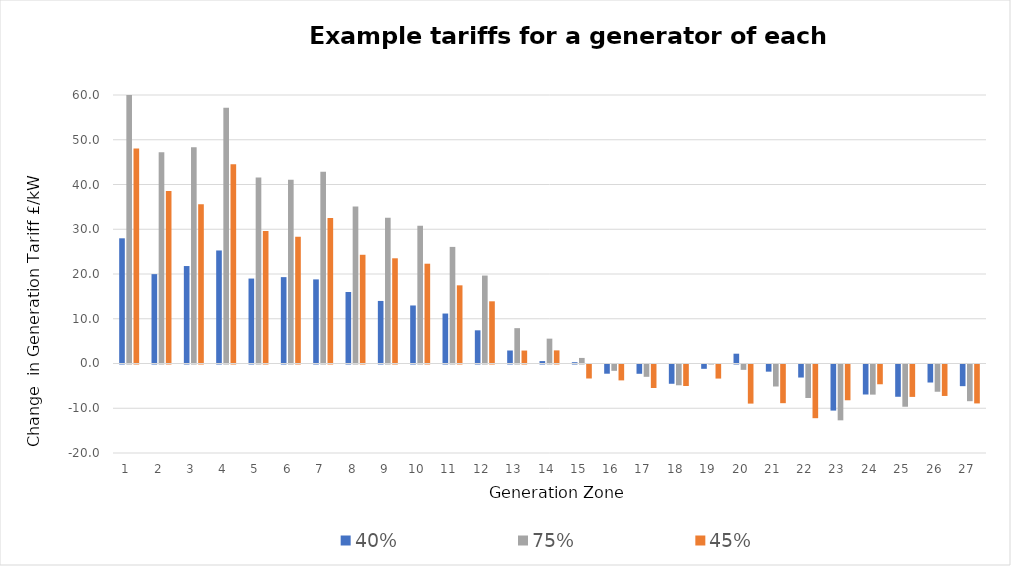
| Category | 40% | 75% | 45% |
|---|---|---|---|
| 1.0 | 27.979 | 62.594 | 48.051 |
| 2.0 | 19.969 | 47.189 | 38.543 |
| 3.0 | 21.779 | 48.308 | 35.599 |
| 4.0 | 25.26 | 57.128 | 44.498 |
| 5.0 | 18.981 | 41.557 | 29.605 |
| 6.0 | 19.302 | 41.046 | 28.322 |
| 7.0 | 18.796 | 42.857 | 32.507 |
| 8.0 | 15.975 | 35.11 | 24.296 |
| 9.0 | 13.98 | 32.595 | 23.511 |
| 10.0 | 12.967 | 30.756 | 22.299 |
| 11.0 | 11.166 | 26.056 | 17.468 |
| 12.0 | 7.416 | 19.651 | 13.898 |
| 13.0 | 2.907 | 7.899 | 2.893 |
| 14.0 | 0.54 | 5.555 | 2.932 |
| 15.0 | 0.292 | 1.243 | -3.127 |
| 16.0 | -2.059 | -1.414 | -3.55 |
| 17.0 | -2.075 | -2.752 | -5.249 |
| 18.0 | -4.308 | -4.643 | -4.81 |
| 19.0 | -0.964 | -0.002 | -3.143 |
| 20.0 | 2.192 | -1.198 | -8.737 |
| 21.0 | -1.6 | -4.916 | -8.643 |
| 22.0 | -2.913 | -7.492 | -11.999 |
| 23.0 | -10.301 | -12.476 | -7.992 |
| 24.0 | -6.704 | -6.733 | -4.416 |
| 25.0 | -7.212 | -9.439 | -7.242 |
| 26.0 | -4.025 | -6.087 | -7.03 |
| 27.0 | -4.842 | -8.201 | -8.698 |